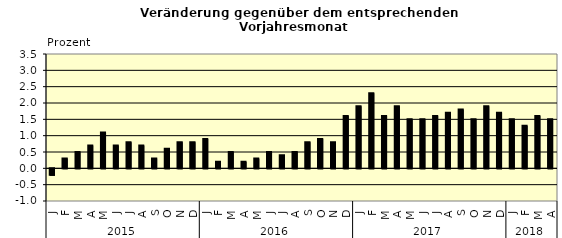
| Category | Series 0 |
|---|---|
| 0 | -0.2 |
| 1 | 0.3 |
| 2 | 0.5 |
| 3 | 0.7 |
| 4 | 1.1 |
| 5 | 0.7 |
| 6 | 0.8 |
| 7 | 0.7 |
| 8 | 0.3 |
| 9 | 0.6 |
| 10 | 0.8 |
| 11 | 0.8 |
| 12 | 0.9 |
| 13 | 0.2 |
| 14 | 0.5 |
| 15 | 0.2 |
| 16 | 0.3 |
| 17 | 0.5 |
| 18 | 0.4 |
| 19 | 0.5 |
| 20 | 0.8 |
| 21 | 0.9 |
| 22 | 0.8 |
| 23 | 1.6 |
| 24 | 1.9 |
| 25 | 2.3 |
| 26 | 1.6 |
| 27 | 1.9 |
| 28 | 1.5 |
| 29 | 1.5 |
| 30 | 1.6 |
| 31 | 1.7 |
| 32 | 1.8 |
| 33 | 1.5 |
| 34 | 1.9 |
| 35 | 1.7 |
| 36 | 1.5 |
| 37 | 1.3 |
| 38 | 1.6 |
| 39 | 1.5 |